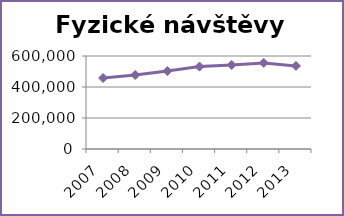
| Category | Fyzické návštěvy celkem |
|---|---|
| 2007.0 | 458031 |
| 2008.0 | 477541 |
| 2009.0 | 502536 |
| 2010.0 | 531677 |
| 2011.0 | 542564 |
| 2012.0 | 555335 |
| 2013.0 | 536076 |